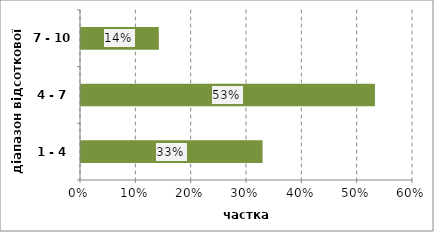
| Category | Series 0 |
|---|---|
| 1 - 4 | 0.328 |
| 4 - 7 | 0.531 |
| 7 - 10 | 0.141 |